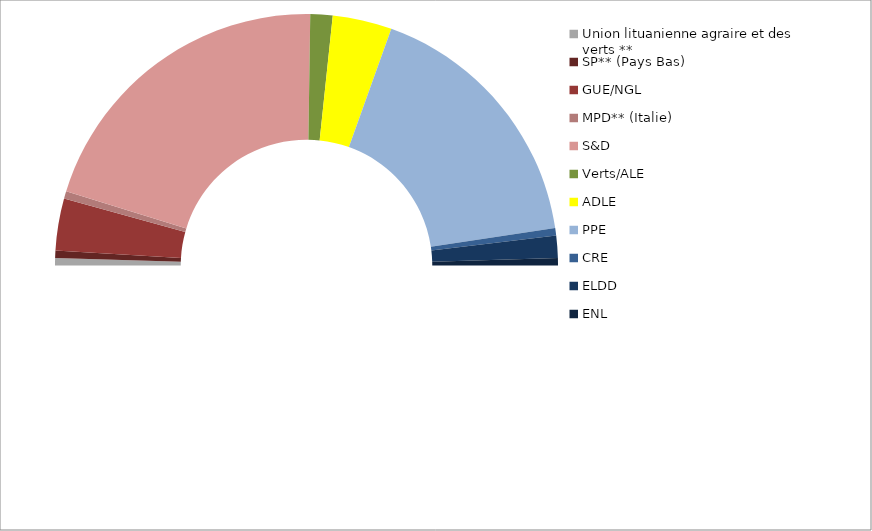
| Category | Series 0 |
|---|---|
| Autre | 105 |
| Union lituanienne agraire et des verts ** | 1 |
| SP** (Pays Bas) | 1 |
| GUE/NGL | 7 |
| MPD** (Italie) | 1 |
| S&D | 43 |
| Verts/ALE | 3 |
| ADLE | 8 |
| PPE | 36 |
| CRE | 1 |
| ELDD | 3 |
| ENL | 1 |